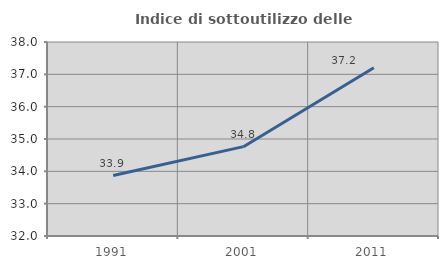
| Category | Indice di sottoutilizzo delle abitazioni  |
|---|---|
| 1991.0 | 33.868 |
| 2001.0 | 34.763 |
| 2011.0 | 37.206 |